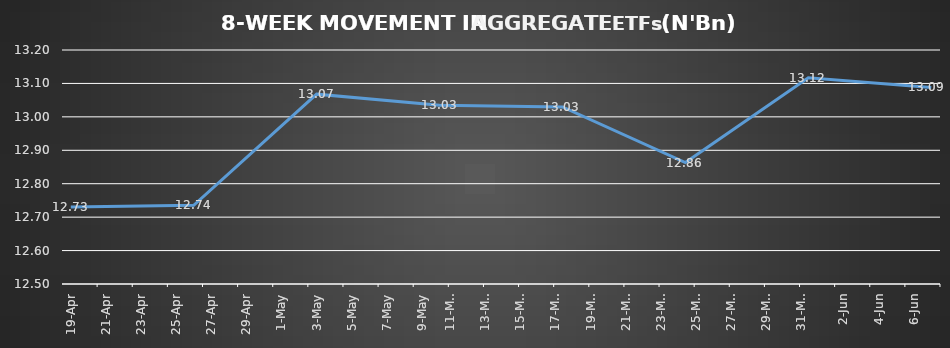
| Category | ETFs AGGREGATE |
|---|---|
| 2024-04-19 | 12.73 |
| 2024-04-26 | 12.735 |
| 2024-05-03 | 13.068 |
| 2024-05-10 | 13.034 |
| 2024-05-17 | 13.03 |
| 2024-05-24 | 12.863 |
| 2024-05-31 | 13.117 |
| 2024-06-07 | 13.088 |